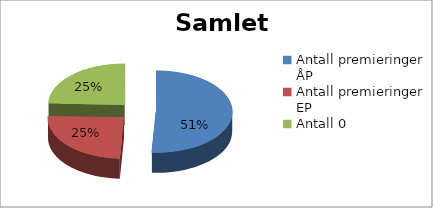
| Category | Antall starter |
|---|---|
| Antall premieringer ÅP | 29 |
| Antall premieringer EP | 14 |
| Antall 0 | 14 |